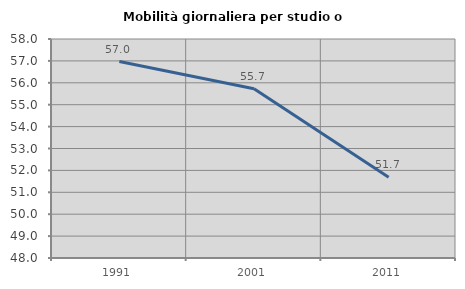
| Category | Mobilità giornaliera per studio o lavoro |
|---|---|
| 1991.0 | 56.971 |
| 2001.0 | 55.725 |
| 2011.0 | 51.685 |